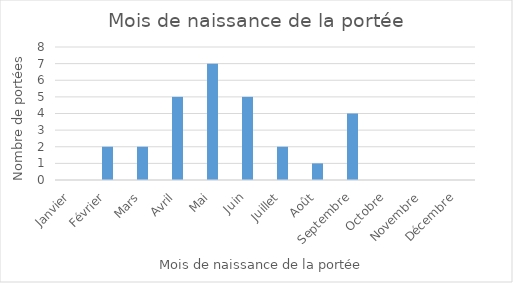
| Category | Series 0 |
|---|---|
| Janvier | 0 |
| Février | 2 |
| Mars | 2 |
| Avril | 5 |
| Mai | 7 |
| Juin | 5 |
| Juillet | 2 |
| Août | 1 |
| Septembre | 4 |
| Octobre | 0 |
| Novembre | 0 |
| Décembre | 0 |